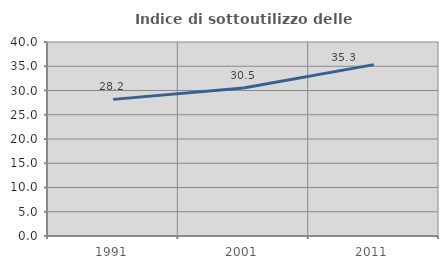
| Category | Indice di sottoutilizzo delle abitazioni  |
|---|---|
| 1991.0 | 28.169 |
| 2001.0 | 30.529 |
| 2011.0 | 35.332 |